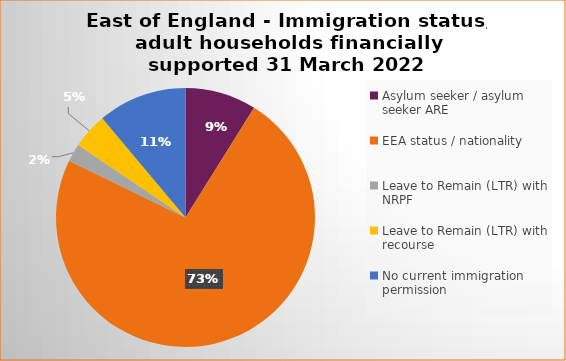
| Category | Number  | Percentage |
|---|---|---|
| Asylum seeker / asylum seeker ARE | 4 | 0.089 |
| EEA status / nationality  | 33 | 0.733 |
| Leave to Remain (LTR) with NRPF | 1 | 0.022 |
| Leave to Remain (LTR) with recourse | 2 | 0.05 |
| No current immigration permission | 5 | 0.111 |